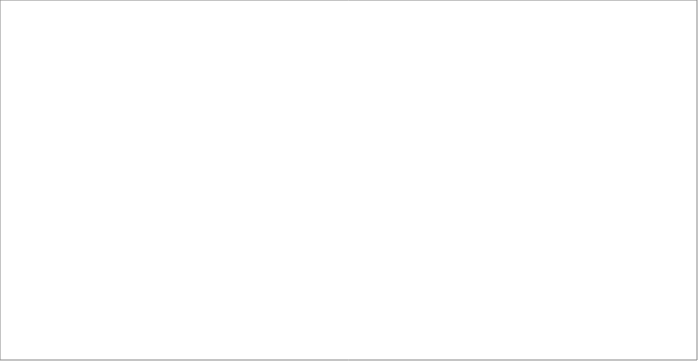
| Category | 2008 | 2009 | 2010 | 2011 | 2012 | 2013 |
|---|---|---|---|---|---|---|
| Afganistan | 12 | 12 | 3 | 1 | 1 | 4 |